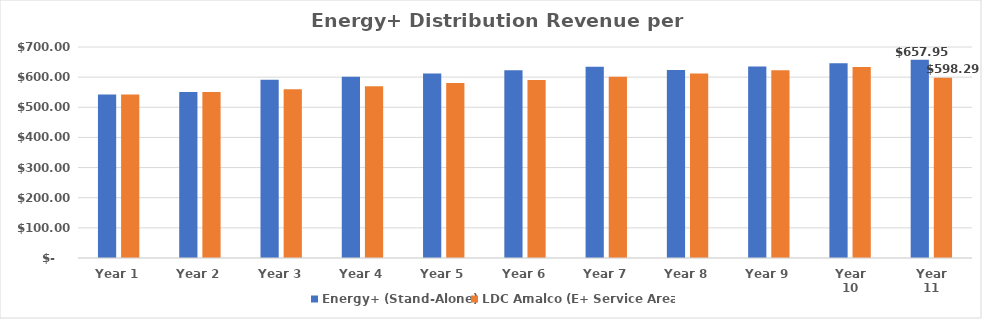
| Category | Energy+ (Stand-Alone) | LDC Amalco (E+ Service Area) |
|---|---|---|
| Year 1 | 542.797 | 542.797 |
| Year 2 | 550.365 | 550.365 |
| Year 3 | 591.156 | 560.139 |
| Year 4 | 601.651 | 570.096 |
| Year 5 | 612.345 | 580.24 |
| Year 6 | 623.238 | 590.575 |
| Year 7 | 634.337 | 601.103 |
| Year 8 | 623.952 | 611.83 |
| Year 9 | 635.077 | 622.758 |
| Year 10 | 646.405 | 633.892 |
| Year 11 | 657.947 | 598.289 |